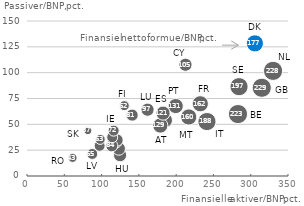
| Category | Land |
|---|---|
| 314.82559368160696 | 85.392 |
| 329.9490978975955 | 101.767 |
| 282.7530084412212 | 60.081 |
| 284.09199206999534 | 86.625 |
| 240.78355352574016 | 53.083 |
| 305.3867410464707 | 128.499 |
| 232.3923073107006 | 69.902 |
| 216.7886400415254 | 57.188 |
| 199.0213397929039 | 67.986 |
| 184.49485865745285 | 54.303 |
| 178.30708184622398 | 49.183 |
| 182.32519018128662 | 60.937 |
| 212.40861864771747 | 107.728 |
| 124.69946010875938 | 20.236 |
| 161.23075661732707 | 64.471 |
| 122.76397988724668 | 26.786 |
| 119.19586552000365 | 33.203 |
| 120.5976224502663 | 34.934 |
| 113.38600651627004 | 29.522 |
| 140.56177752551028 | 59.247 |
| 114.25819072281016 | 37.532 |
| 115.98338197557507 | 44.044 |
| 96.95055674482666 | 29.552 |
| 86.88664941311791 | 21.771 |
| 98.1289714056957 | 35.436 |
| 130.39552775146188 | 68.122 |
| 60.57075675281215 | 17.872 |
| 81.31724350893816 | 44.062 |